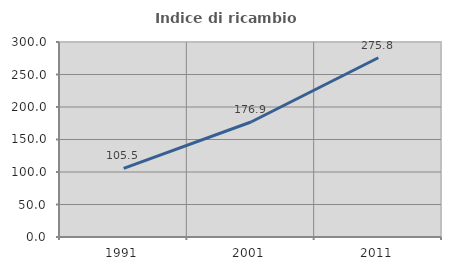
| Category | Indice di ricambio occupazionale  |
|---|---|
| 1991.0 | 105.539 |
| 2001.0 | 176.923 |
| 2011.0 | 275.818 |